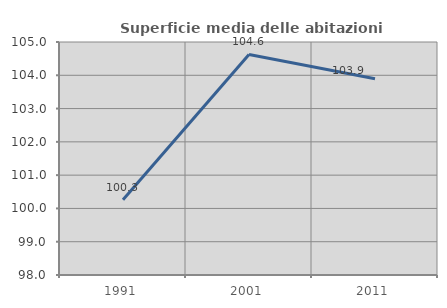
| Category | Superficie media delle abitazioni occupate |
|---|---|
| 1991.0 | 100.259 |
| 2001.0 | 104.627 |
| 2011.0 | 103.897 |